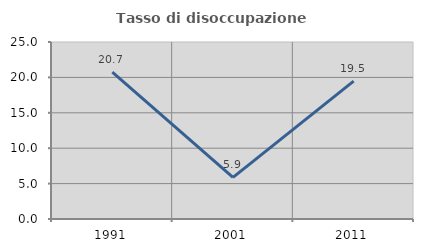
| Category | Tasso di disoccupazione giovanile  |
|---|---|
| 1991.0 | 20.741 |
| 2001.0 | 5.882 |
| 2011.0 | 19.481 |